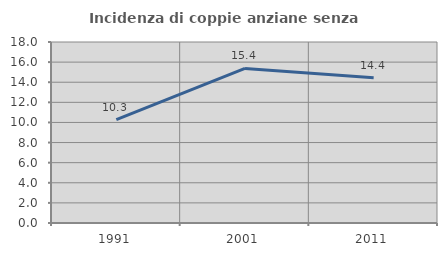
| Category | Incidenza di coppie anziane senza figli  |
|---|---|
| 1991.0 | 10.275 |
| 2001.0 | 15.373 |
| 2011.0 | 14.441 |